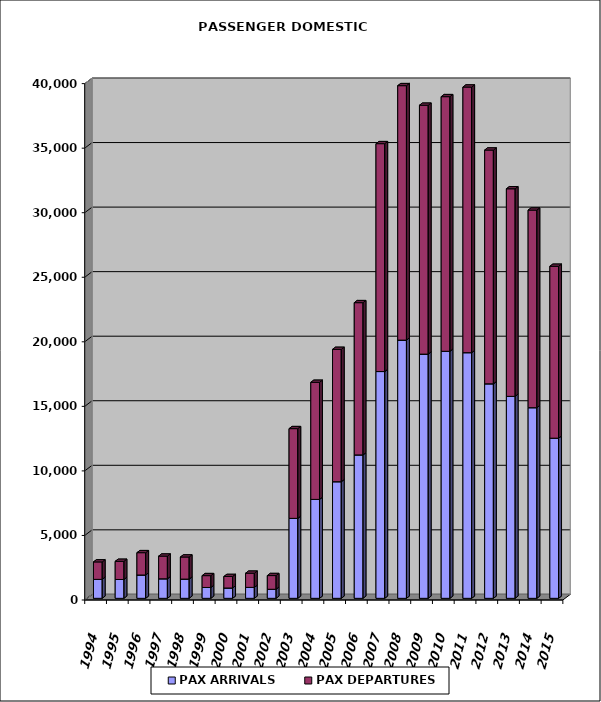
| Category | PAX ARRIVALS | PAX DEPARTURES |
|---|---|---|
| 1994.0 | 1467 | 1352 |
| 1995.0 | 1459 | 1405 |
| 1996.0 | 1807 | 1728 |
| 1997.0 | 1512 | 1758 |
| 1998.0 | 1489 | 1711 |
| 1999.0 | 839 | 918 |
| 2000.0 | 799 | 891 |
| 2001.0 | 847 | 1098 |
| 2002.0 | 702 | 1060 |
| 2003.0 | 6194 | 6950 |
| 2004.0 | 7662 | 9069 |
| 2005.0 | 9032 | 10251 |
| 2006.0 | 11109 | 11793 |
| 2007.0 | 17566 | 17652 |
| 2008.0 | 20000 | 19711 |
| 2009.0 | 18916 | 19279 |
| 2010.0 | 19136 | 19723 |
| 2011.0 | 19029 | 20575 |
| 2012.0 | 16617 | 18107 |
| 2013.0 | 15644 | 16080 |
| 2014.0 | 14767 | 15306 |
| 2015.0 | 12404 | 13316 |